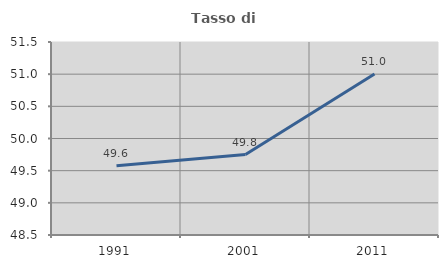
| Category | Tasso di occupazione   |
|---|---|
| 1991.0 | 49.578 |
| 2001.0 | 49.75 |
| 2011.0 | 51.002 |